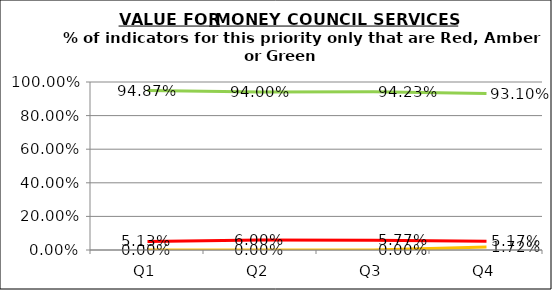
| Category | Green | Amber | Red |
|---|---|---|---|
| Q1 | 0.949 | 0 | 0.051 |
| Q2 | 0.94 | 0 | 0.06 |
| Q3 | 0.942 | 0 | 0.058 |
| Q4 | 0.931 | 0.017 | 0.052 |